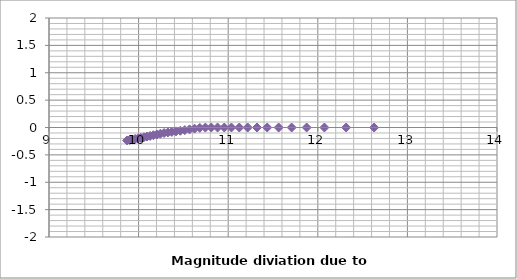
| Category | Series 0 |
|---|---|
| 9.871833313864176 | -0.237 |
| 9.900787995238714 | -0.228 |
| 9.930536053487984 | -0.219 |
| 9.961122194530512 | -0.209 |
| 9.992595012800564 | -0.199 |
| 10.025007455711483 | -0.189 |
| 10.058417359606436 | -0.178 |
| 10.092888070820518 | -0.166 |
| 10.128489168607045 | -0.154 |
| 10.165297310658811 | -0.141 |
| 10.203397227050653 | -0.127 |
| 10.242882895008734 | -0.113 |
| 10.283858935479156 | -0.1 |
| 10.326442283726106 | -0.09 |
| 10.370764201127185 | -0.081 |
| 10.416972715362219 | -0.071 |
| 10.465235603350685 | -0.06 |
| 10.515744068571403 | -0.048 |
| 10.568717316246248 | -0.035 |
| 10.624408303024127 | -0.021 |
| 10.683111042647937 | -0.007 |
| 10.745170001960517 | -0.001 |
| 10.810992348766389 | 0 |
| 10.881064157766998 | 0 |
| 10.955972216210606 | 0 |
| 11.036433924639109 | 0 |
| 11.123339190287139 | 0 |
| 11.217810592510638 | 0 |
| 11.321292305406201 | 0 |
| 11.435686031807888 | 0 |
| 11.563567337926342 | 0 |
| 11.708547205370559 | 0 |
| 11.875914179447092 | 0 |
| 12.073867294566154 | 0 |
| 12.316142327086295 | 0 |
| 12.628489168607045 | 0 |